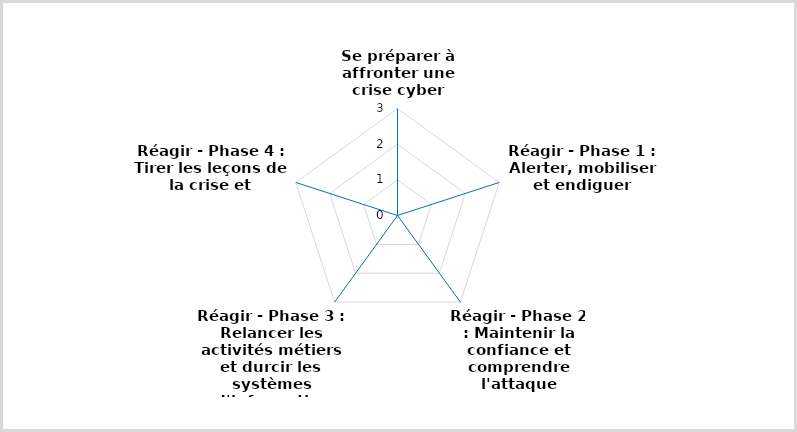
| Category | Moyenne |
|---|---|
| Se préparer à affronter une crise cyber | 0 |
| Réagir - Phase 1 : Alerter, mobiliser et endiguer | 0 |
| Réagir - Phase 2 : Maintenir la confiance et comprendre l'attaque | 0 |
| Réagir - Phase 3 : Relancer les activités métiers et durcir les systèmes d'information | 0 |
| Réagir - Phase 4 : Tirer les leçons de la crise et capitaliser | 0 |